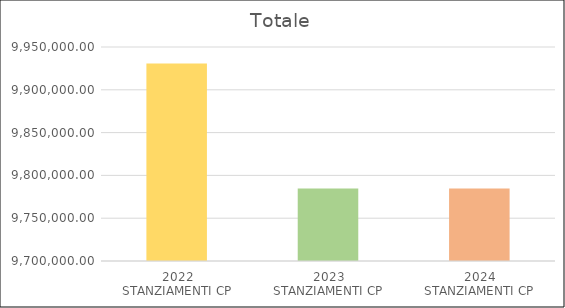
| Category | Series 0 |
|---|---|
| 2022
STANZIAMENTI CP | 9930666 |
| 2023
STANZIAMENTI CP | 9784658 |
| 2024
STANZIAMENTI CP | 9784658 |